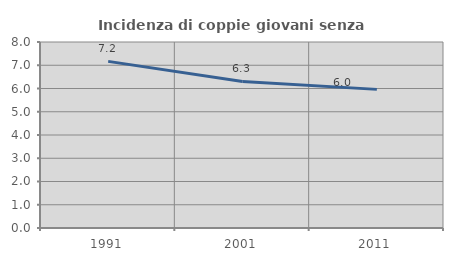
| Category | Incidenza di coppie giovani senza figli |
|---|---|
| 1991.0 | 7.166 |
| 2001.0 | 6.303 |
| 2011.0 | 5.962 |